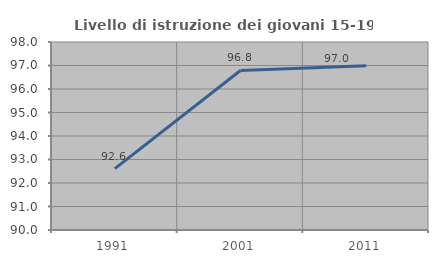
| Category | Livello di istruzione dei giovani 15-19 anni |
|---|---|
| 1991.0 | 92.614 |
| 2001.0 | 96.789 |
| 2011.0 | 96.988 |